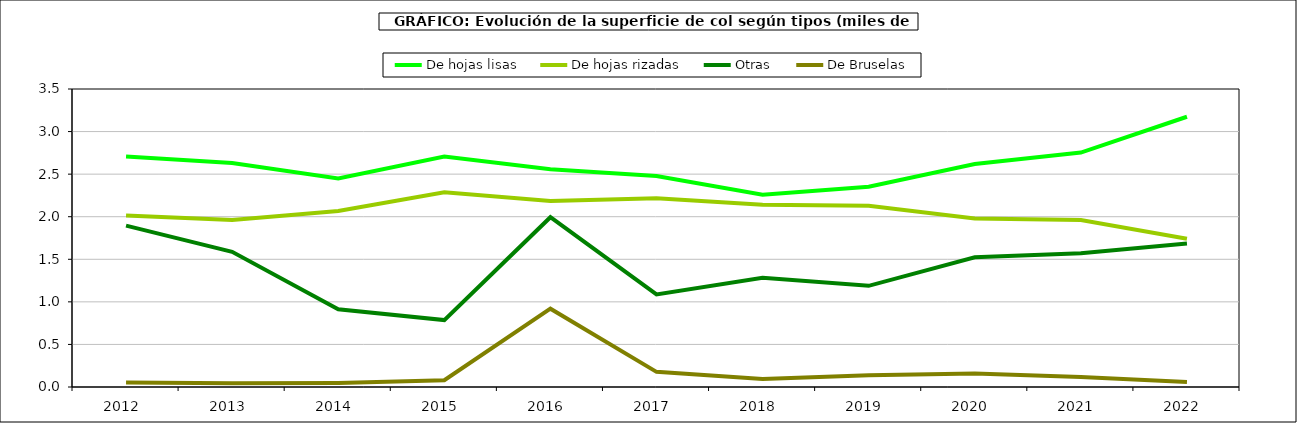
| Category | De hojas lisas | De hojas rizadas | Otras | De Bruselas |
|---|---|---|---|---|
| 2012.0 | 2.707 | 2.014 | 1.895 | 0.053 |
| 2013.0 | 2.631 | 1.962 | 1.588 | 0.043 |
| 2014.0 | 2.45 | 2.067 | 0.914 | 0.048 |
| 2015.0 | 2.707 | 2.288 | 0.786 | 0.08 |
| 2016.0 | 2.557 | 2.186 | 1.994 | 0.92 |
| 2017.0 | 2.479 | 2.218 | 1.087 | 0.178 |
| 2018.0 | 2.257 | 2.141 | 1.282 | 0.094 |
| 2019.0 | 2.351 | 2.128 | 1.188 | 0.139 |
| 2020.0 | 2.62 | 1.979 | 1.523 | 0.16 |
| 2021.0 | 2.753 | 1.96 | 1.57 | 0.118 |
| 2022.0 | 3.174 | 1.741 | 1.686 | 0.059 |